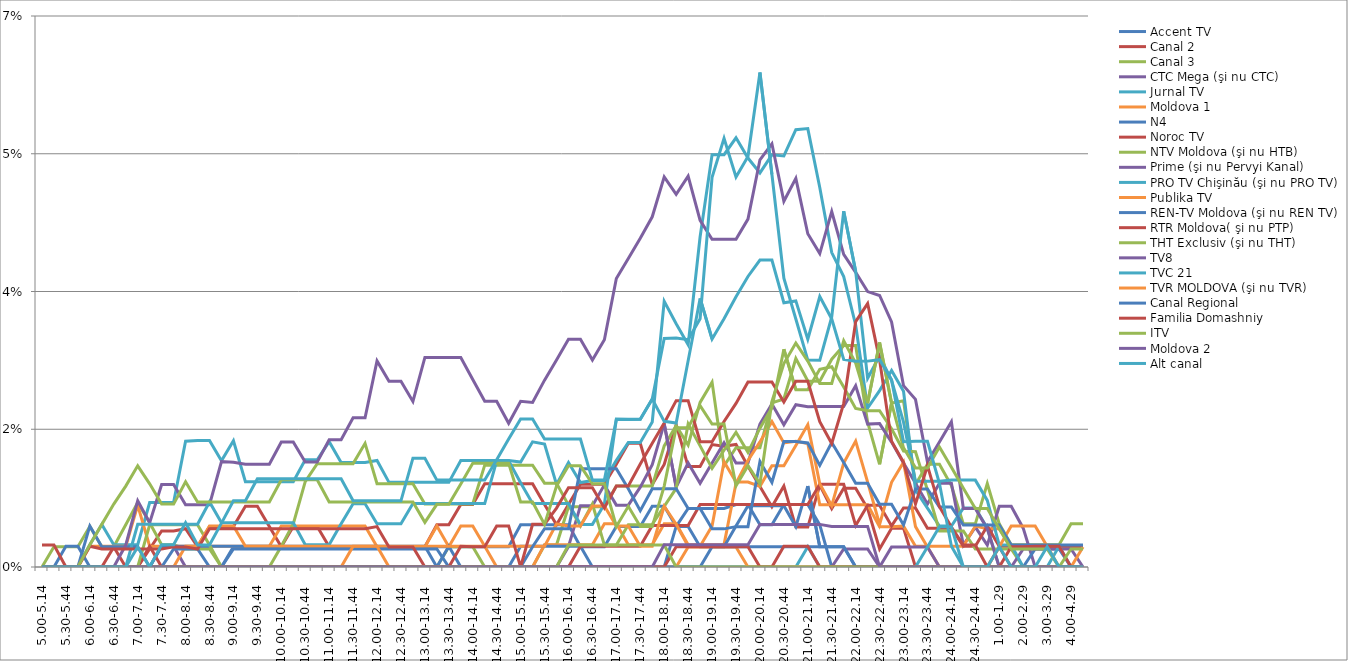
| Category | Accent TV | Canal 2 | Canal 3 | CTC Mega (şi nu CTC) | Jurnal TV | Moldova 1 | N4 | Noroc TV | NTV Moldova (şi nu HTB) | Prime (şi nu Pervyi Kanal) | PRO TV Chişinău (şi nu PRO TV) | Publika TV  | REN-TV Moldova (şi nu REN TV)  | RTR Moldova( şi nu PTP)  | THT Exclusiv (şi nu THT) | TV8 | TVC 21 | TVR MOLDOVA (şi nu TVR) | Canal Regional | Familia Domashniy | ITV | Moldova 2 | Alt canal |
|---|---|---|---|---|---|---|---|---|---|---|---|---|---|---|---|---|---|---|---|---|---|---|---|
| 5.00-5.14 | 0 | 0 | 0 | 0 | 0 | 0 | 0 | 0 | 0 | 0 | 0 | 0 | 0 | 0.003 | 0 | 0 | 0 | 0 | 0 | 0 | 0 | 0 | 0 |
| 5.15-5.29 | 0 | 0 | 0.003 | 0 | 0 | 0 | 0 | 0 | 0 | 0 | 0 | 0 | 0 | 0.003 | 0 | 0 | 0 | 0 | 0 | 0 | 0 | 0 | 0 |
| 5.30-5.44 | 0 | 0 | 0.003 | 0 | 0 | 0 | 0 | 0 | 0 | 0 | 0 | 0 | 0.003 | 0 | 0 | 0 | 0 | 0 | 0 | 0 | 0 | 0 | 0 |
| 5.45-5.59 | 0 | 0 | 0.003 | 0 | 0 | 0 | 0 | 0 | 0 | 0 | 0 | 0 | 0.003 | 0 | 0 | 0 | 0 | 0 | 0 | 0 | 0 | 0 | 0 |
| 6.00-6.14 | 0 | 0 | 0.005 | 0 | 0.003 | 0.003 | 0.005 | 0 | 0 | 0 | 0 | 0 | 0 | 0.003 | 0.003 | 0 | 0 | 0 | 0 | 0 | 0 | 0 | 0 |
| 6.15-6.29 | 0 | 0 | 0.003 | 0 | 0.005 | 0.003 | 0.003 | 0 | 0 | 0 | 0 | 0 | 0 | 0.002 | 0.005 | 0 | 0 | 0 | 0 | 0 | 0 | 0 | 0 |
| 6.30-6.44 | 0 | 0.003 | 0.003 | 0 | 0.003 | 0.003 | 0.003 | 0 | 0 | 0 | 0 | 0 | 0 | 0.002 | 0.008 | 0 | 0 | 0 | 0 | 0 | 0 | 0 | 0 |
| 6.45-6.59 | 0 | 0 | 0.005 | 0 | 0.003 | 0.003 | 0.003 | 0 | 0 | 0.003 | 0 | 0 | 0 | 0.002 | 0.01 | 0 | 0 | 0 | 0 | 0 | 0 | 0 | 0 |
| 7.00-7.14 | 0 | 0 | 0.008 | 0 | 0.003 | 0.008 | 0.003 | 0 | 0 | 0.008 | 0.005 | 0 | 0 | 0.002 | 0.013 | 0 | 0 | 0 | 0 | 0 | 0 | 0 | 0.003 |
| 7.15-7.29 | 0 | 0.002 | 0.006 | 0 | 0.008 | 0.003 | 0 | 0.003 | 0.005 | 0.006 | 0.005 | 0 | 0 | 0.002 | 0.011 | 0 | 0 | 0 | 0 | 0 | 0 | 0 | 0 |
| 7.30-7.44 | 0 | 0.005 | 0.003 | 0.003 | 0.008 | 0.003 | 0.003 | 0 | 0.005 | 0.01 | 0.005 | 0 | 0 | 0.002 | 0.008 | 0 | 0 | 0 | 0 | 0 | 0 | 0 | 0.003 |
| 7.45-7.59 | 0 | 0.005 | 0.003 | 0.003 | 0.008 | 0.003 | 0.003 | 0 | 0.005 | 0.01 | 0.005 | 0 | 0.002 | 0.003 | 0.008 | 0 | 0 | 0 | 0 | 0 | 0 | 0 | 0.003 |
| 8.00-8.14 | 0 | 0.005 | 0.002 | 0 | 0.016 | 0.003 | 0.003 | 0 | 0.005 | 0.008 | 0.005 | 0.003 | 0.002 | 0.003 | 0.011 | 0 | 0 | 0 | 0 | 0 | 0 | 0 | 0.006 |
| 8.15-8.29 | 0 | 0.003 | 0.002 | 0 | 0.016 | 0.003 | 0.003 | 0 | 0.005 | 0.008 | 0.005 | 0.003 | 0.002 | 0.002 | 0.008 | 0 | 0 | 0 | 0 | 0 | 0 | 0 | 0.003 |
| 8.30-8.44 | 0 | 0.005 | 0.002 | 0 | 0.016 | 0.003 | 0.003 | 0 | 0.003 | 0.008 | 0.008 | 0.005 | 0 | 0.005 | 0.008 | 0 | 0 | 0 | 0 | 0 | 0 | 0 | 0.003 |
| 8.45-8.59 | 0 | 0.005 | 0 | 0 | 0.013 | 0.003 | 0.003 | 0 | 0 | 0.013 | 0.006 | 0.005 | 0 | 0.005 | 0.008 | 0 | 0 | 0 | 0 | 0 | 0 | 0 | 0.006 |
| 9.00-9.14 | 0.003 | 0.005 | 0 | 0 | 0.016 | 0.003 | 0.003 | 0 | 0 | 0.013 | 0.006 | 0.005 | 0.002 | 0.005 | 0.008 | 0 | 0 | 0 | 0 | 0 | 0 | 0 | 0.008 |
| 9.15-9.29 | 0.003 | 0.008 | 0 | 0 | 0.011 | 0.003 | 0.003 | 0 | 0 | 0.013 | 0.006 | 0.003 | 0.002 | 0.005 | 0.008 | 0 | 0 | 0 | 0 | 0 | 0 | 0 | 0.008 |
| 9.30-9.44 | 0.003 | 0.008 | 0 | 0 | 0.011 | 0.003 | 0.003 | 0 | 0 | 0.013 | 0.006 | 0.003 | 0.002 | 0.005 | 0.008 | 0 | 0 | 0 | 0 | 0 | 0 | 0 | 0.011 |
| 9.45-9.59 | 0.003 | 0.005 | 0 | 0 | 0.011 | 0.003 | 0.003 | 0 | 0 | 0.013 | 0.006 | 0.003 | 0.002 | 0.005 | 0.008 | 0 | 0 | 0 | 0 | 0 | 0 | 0 | 0.011 |
| 10.00-10.14 | 0.003 | 0.003 | 0 | 0 | 0.011 | 0.005 | 0.003 | 0 | 0.003 | 0.016 | 0.006 | 0.003 | 0.002 | 0.005 | 0.011 | 0 | 0 | 0 | 0 | 0 | 0 | 0 | 0.011 |
| 10.15-10.29 | 0.003 | 0.005 | 0 | 0 | 0.011 | 0.005 | 0.003 | 0 | 0.005 | 0.016 | 0.006 | 0.003 | 0.002 | 0.005 | 0.011 | 0 | 0 | 0 | 0 | 0 | 0 | 0 | 0.011 |
| 10.30-10.44 | 0.003 | 0.005 | 0 | 0 | 0.014 | 0.005 | 0.003 | 0 | 0.011 | 0.013 | 0.003 | 0.003 | 0.002 | 0.005 | 0.011 | 0 | 0 | 0 | 0 | 0 | 0 | 0 | 0.011 |
| 10.45-10.59 | 0.003 | 0.005 | 0 | 0 | 0.014 | 0.005 | 0.003 | 0 | 0.013 | 0.013 | 0.003 | 0.003 | 0.002 | 0.005 | 0.011 | 0 | 0 | 0 | 0 | 0 | 0 | 0 | 0.011 |
| 11.00-11.14 | 0.003 | 0.003 | 0 | 0 | 0.016 | 0.005 | 0.003 | 0 | 0.013 | 0.016 | 0.003 | 0.003 | 0.002 | 0.005 | 0.008 | 0 | 0 | 0 | 0 | 0 | 0 | 0 | 0.011 |
| 11.15-11.29 | 0.003 | 0.003 | 0 | 0 | 0.013 | 0.005 | 0.003 | 0 | 0.013 | 0.016 | 0.005 | 0.003 | 0.002 | 0.005 | 0.008 | 0 | 0 | 0 | 0 | 0 | 0 | 0 | 0.011 |
| 11.30-11.44 | 0.003 | 0.003 | 0 | 0 | 0.013 | 0.005 | 0.003 | 0 | 0.013 | 0.019 | 0.008 | 0.003 | 0.002 | 0.005 | 0.008 | 0 | 0 | 0.003 | 0 | 0 | 0 | 0 | 0.008 |
| 11.45-11.59 | 0.003 | 0.003 | 0 | 0 | 0.013 | 0.005 | 0.003 | 0 | 0.016 | 0.019 | 0.008 | 0.003 | 0.002 | 0.005 | 0.008 | 0 | 0 | 0.003 | 0 | 0 | 0 | 0 | 0.008 |
| 12.00-12.14 | 0.003 | 0.003 | 0 | 0 | 0.014 | 0.003 | 0.003 | 0 | 0.011 | 0.026 | 0.005 | 0.003 | 0.002 | 0.005 | 0.008 | 0 | 0 | 0.003 | 0 | 0 | 0 | 0 | 0.008 |
| 12.15-12.29 | 0.003 | 0.003 | 0 | 0 | 0.011 | 0.003 | 0.003 | 0 | 0.011 | 0.024 | 0.005 | 0.003 | 0.002 | 0.003 | 0.008 | 0 | 0 | 0 | 0 | 0 | 0 | 0 | 0.008 |
| 12.30-12.44 | 0.003 | 0.003 | 0 | 0 | 0.011 | 0.003 | 0.003 | 0 | 0.011 | 0.024 | 0.005 | 0.003 | 0.002 | 0.003 | 0.008 | 0 | 0 | 0 | 0 | 0 | 0 | 0 | 0.008 |
| 12.45-12.59 | 0.003 | 0.003 | 0 | 0 | 0.011 | 0.003 | 0.003 | 0 | 0.011 | 0.021 | 0.008 | 0.003 | 0.002 | 0.003 | 0.008 | 0 | 0 | 0 | 0 | 0 | 0 | 0 | 0.014 |
| 13.00-13.14 | 0.003 | 0.003 | 0 | 0 | 0.011 | 0.003 | 0.003 | 0 | 0.008 | 0.027 | 0.008 | 0.003 | 0.002 | 0 | 0.006 | 0 | 0 | 0 | 0 | 0 | 0 | 0 | 0.014 |
| 13.15-13.29 | 0.003 | 0.005 | 0 | 0 | 0.011 | 0.005 | 0 | 0 | 0.008 | 0.027 | 0.008 | 0.003 | 0.002 | 0 | 0.008 | 0 | 0 | 0 | 0 | 0 | 0 | 0 | 0.011 |
| 13.30-13.44 | 0.003 | 0.005 | 0.003 | 0 | 0.011 | 0.003 | 0.003 | 0 | 0.008 | 0.027 | 0.008 | 0.003 | 0 | 0 | 0.008 | 0 | 0 | 0 | 0 | 0 | 0 | 0 | 0.011 |
| 13.45-13.59 | 0.003 | 0.008 | 0.003 | 0 | 0.014 | 0.005 | 0 | 0 | 0.008 | 0.027 | 0.008 | 0.003 | 0 | 0.003 | 0.011 | 0 | 0 | 0 | 0 | 0 | 0 | 0 | 0.011 |
| 14.00-14.14 | 0.003 | 0.008 | 0.003 | 0 | 0.014 | 0.005 | 0 | 0 | 0.008 | 0.024 | 0.008 | 0.003 | 0 | 0.003 | 0.013 | 0 | 0 | 0 | 0 | 0 | 0 | 0 | 0.011 |
| 14.15-14.29 | 0.003 | 0.011 | 0 | 0 | 0.014 | 0.003 | 0 | 0 | 0.013 | 0.021 | 0.008 | 0.003 | 0 | 0.003 | 0.013 | 0 | 0 | 0 | 0 | 0 | 0 | 0 | 0.011 |
| 14.30-14.44 | 0.003 | 0.011 | 0 | 0 | 0.014 | 0 | 0 | 0 | 0.013 | 0.021 | 0.013 | 0.003 | 0 | 0.005 | 0.013 | 0 | 0 | 0 | 0 | 0 | 0 | 0 | 0.014 |
| 14.45-14.59 | 0.003 | 0.011 | 0 | 0 | 0.014 | 0 | 0 | 0 | 0.013 | 0.018 | 0.013 | 0.003 | 0 | 0.005 | 0.013 | 0 | 0 | 0 | 0 | 0 | 0 | 0 | 0.016 |
| 15.00-15.14 | 0.005 | 0.011 | 0 | 0 | 0.013 | 0 | 0.003 | 0 | 0.013 | 0.021 | 0.011 | 0.003 | 0 | 0 | 0.008 | 0 | 0 | 0 | 0 | 0 | 0 | 0 | 0.019 |
| 15.15-15.29 | 0.005 | 0.011 | 0 | 0 | 0.016 | 0 | 0.003 | 0 | 0.013 | 0.021 | 0.008 | 0.003 | 0.003 | 0.005 | 0.008 | 0 | 0 | 0 | 0 | 0 | 0 | 0 | 0.019 |
| 15.30-15.44 | 0.005 | 0.008 | 0.003 | 0 | 0.016 | 0.003 | 0.003 | 0 | 0.011 | 0.024 | 0.008 | 0.003 | 0.005 | 0.005 | 0.005 | 0 | 0 | 0 | 0 | 0 | 0 | 0 | 0.016 |
| 15.45-15.59 | 0.005 | 0.005 | 0.003 | 0 | 0.01 | 0.003 | 0.003 | 0 | 0.011 | 0.026 | 0.008 | 0.005 | 0.005 | 0.007 | 0.01 | 0 | 0 | 0 | 0 | 0 | 0 | 0 | 0.016 |
| 16.00-16.14 | 0.005 | 0.008 | 0.008 | 0.003 | 0.013 | 0.003 | 0.003 | 0 | 0.008 | 0.029 | 0.008 | 0.005 | 0.005 | 0.01 | 0.013 | 0 | 0 | 0 | 0 | 0 | 0.003 | 0 | 0.016 |
| 16.15-16.29 | 0.003 | 0.011 | 0.008 | 0.008 | 0.011 | 0.003 | 0.003 | 0.003 | 0.005 | 0.029 | 0.005 | 0.005 | 0.012 | 0.01 | 0.013 | 0 | 0 | 0 | 0 | 0 | 0.003 | 0 | 0.016 |
| 16.30-16.44 | 0.003 | 0.011 | 0.008 | 0.008 | 0.011 | 0.003 | 0 | 0.003 | 0.008 | 0.026 | 0.005 | 0.008 | 0.012 | 0.01 | 0.011 | 0 | 0 | 0 | 0 | 0 | 0.003 | 0 | 0.011 |
| 16.45-16.59 | 0.003 | 0.011 | 0.008 | 0.01 | 0.011 | 0.005 | 0 | 0.003 | 0.003 | 0.029 | 0.008 | 0.008 | 0.012 | 0.008 | 0.011 | 0 | 0 | 0 | 0 | 0 | 0.003 | 0 | 0.011 |
| 17.00-17.14 | 0.005 | 0.013 | 0.01 | 0.008 | 0.014 | 0.005 | 0 | 0.003 | 0.003 | 0.037 | 0.019 | 0.005 | 0.012 | 0.01 | 0.005 | 0 | 0 | 0 | 0 | 0 | 0.003 | 0 | 0.019 |
| 17.15-17.29 | 0.005 | 0.016 | 0.01 | 0.008 | 0.016 | 0.003 | 0 | 0.003 | 0.005 | 0.039 | 0.019 | 0.005 | 0.01 | 0.01 | 0.008 | 0 | 0 | 0 | 0 | 0 | 0.003 | 0 | 0.019 |
| 17.30-17.44 | 0.005 | 0.016 | 0.01 | 0.01 | 0.016 | 0.003 | 0 | 0.003 | 0.005 | 0.042 | 0.019 | 0.003 | 0.007 | 0.013 | 0.005 | 0 | 0 | 0 | 0 | 0 | 0.003 | 0 | 0.019 |
| 17.45-17.59 | 0.008 | 0.01 | 0.01 | 0.013 | 0.018 | 0.003 | 0 | 0.005 | 0.005 | 0.044 | 0.021 | 0.003 | 0.01 | 0.016 | 0.005 | 0 | 0 | 0 | 0 | 0 | 0.003 | 0 | 0.021 |
| 18.00-18.14 | 0.008 | 0.013 | 0.015 | 0.018 | 0.034 | 0.005 | 0 | 0.005 | 0.008 | 0.05 | 0.029 | 0.008 | 0.01 | 0.018 | 0.01 | 0 | 0 | 0 | 0 | 0 | 0.003 | 0.003 | 0.019 |
| 18.15-18.29 | 0.005 | 0.018 | 0.018 | 0.01 | 0.031 | 0.005 | 0.005 | 0.005 | 0.01 | 0.047 | 0.029 | 0.005 | 0.01 | 0.021 | 0.018 | 0 | 0 | 0 | 0 | 0.003 | 0 | 0.003 | 0.018 |
| 18.30-18.44 | 0.007 | 0.013 | 0.015 | 0.013 | 0.028 | 0.003 | 0.005 | 0.005 | 0.018 | 0.05 | 0.029 | 0.003 | 0.007 | 0.021 | 0.018 | 0 | 0 | 0.003 | 0 | 0.003 | 0 | 0.003 | 0.026 |
| 18.45-18.59 | 0.007 | 0.013 | 0.021 | 0.011 | 0.042 | 0.003 | 0.003 | 0.008 | 0.015 | 0.044 | 0.032 | 0.003 | 0.007 | 0.016 | 0.021 | 0 | 0 | 0.003 | 0 | 0.003 | 0 | 0.003 | 0.034 |
| 19.00-19.14 | 0.007 | 0.016 | 0.023 | 0.013 | 0.052 | 0.003 | 0.003 | 0.008 | 0.013 | 0.042 | 0.05 | 0.005 | 0.005 | 0.016 | 0.018 | 0 | 0 | 0.003 | 0.003 | 0.003 | 0 | 0.003 | 0.029 |
| 19.15-19.29 | 0.007 | 0.015 | 0.013 | 0.016 | 0.052 | 0.003 | 0.003 | 0.008 | 0.015 | 0.042 | 0.054 | 0.013 | 0.005 | 0.018 | 0.018 | 0 | 0 | 0.003 | 0.003 | 0.003 | 0 | 0.003 | 0.032 |
| 19.30-19.44 | 0.008 | 0.016 | 0.015 | 0.013 | 0.055 | 0.011 | 0.005 | 0.008 | 0.017 | 0.042 | 0.05 | 0.011 | 0.005 | 0.021 | 0.01 | 0 | 0 | 0.003 | 0.003 | 0.003 | 0 | 0.003 | 0.034 |
| 19.45-19.59 | 0.008 | 0.013 | 0.015 | 0.013 | 0.052 | 0.014 | 0.008 | 0.008 | 0.015 | 0.044 | 0.052 | 0.011 | 0.005 | 0.024 | 0.013 | 0 | 0 | 0 | 0.003 | 0.003 | 0 | 0.003 | 0.037 |
| 20.00-20.14 | 0.005 | 0.01 | 0.015 | 0.018 | 0.05 | 0.016 | 0.008 | 0.008 | 0.018 | 0.052 | 0.063 | 0.01 | 0.013 | 0.024 | 0.011 | 0 | 0 | 0 | 0.003 | 0 | 0 | 0.005 | 0.039 |
| 20.15-20.29 | 0.005 | 0.008 | 0.021 | 0.021 | 0.052 | 0.018 | 0.008 | 0.008 | 0.02 | 0.054 | 0.05 | 0.013 | 0.011 | 0.024 | 0.021 | 0 | 0 | 0 | 0.003 | 0 | 0 | 0.005 | 0.039 |
| 20.30-20.44 | 0.008 | 0.01 | 0.021 | 0.018 | 0.052 | 0.016 | 0.008 | 0.008 | 0.028 | 0.046 | 0.037 | 0.013 | 0.016 | 0.021 | 0.026 | 0 | 0 | 0 | 0.003 | 0.003 | 0 | 0.005 | 0.034 |
| 20.45-20.59 | 0.008 | 0.005 | 0.026 | 0.021 | 0.056 | 0.016 | 0.005 | 0.008 | 0.023 | 0.049 | 0.032 | 0.015 | 0.016 | 0.024 | 0.028 | 0 | 0 | 0 | 0.003 | 0.003 | 0 | 0.005 | 0.034 |
| 21.00-21.14 | 0.008 | 0.005 | 0.024 | 0.02 | 0.056 | 0.016 | 0.01 | 0.008 | 0.023 | 0.042 | 0.026 | 0.018 | 0.016 | 0.024 | 0.026 | 0 | 0.003 | 0 | 0.003 | 0.003 | 0 | 0.005 | 0.029 |
| 21.15-21.29 | 0.005 | 0.01 | 0.024 | 0.02 | 0.048 | 0.008 | 0.003 | 0.011 | 0.025 | 0.04 | 0.026 | 0.011 | 0.013 | 0.018 | 0.023 | 0 | 0 | 0 | 0.003 | 0 | 0 | 0.005 | 0.034 |
| 21.30-21.44 | 0 | 0.007 | 0.026 | 0.02 | 0.04 | 0.008 | 0.003 | 0.011 | 0.025 | 0.045 | 0.032 | 0.008 | 0.016 | 0.016 | 0.023 | 0 | 0 | 0 | 0.003 | 0 | 0 | 0.005 | 0.032 |
| 21.45-21.59 | 0 | 0.01 | 0.028 | 0.02 | 0.037 | 0.008 | 0.003 | 0.011 | 0.023 | 0.04 | 0.045 | 0.013 | 0.013 | 0.021 | 0.029 | 0.002 | 0 | 0 | 0.003 | 0 | 0 | 0.005 | 0.026 |
| 22.00-22.14 | 0 | 0.01 | 0.028 | 0.023 | 0.031 | 0.008 | 0 | 0.005 | 0.02 | 0.037 | 0.038 | 0.016 | 0.011 | 0.031 | 0.026 | 0.002 | 0 | 0 | 0 | 0 | 0 | 0.005 | 0.026 |
| 22.15-22.29 | 0 | 0.007 | 0.018 | 0.018 | 0.02 | 0.008 | 0 | 0.008 | 0.02 | 0.035 | 0.024 | 0.011 | 0.011 | 0.033 | 0.021 | 0.002 | 0 | 0 | 0 | 0 | 0 | 0.005 | 0.026 |
| 22.30-22.44 | 0 | 0.002 | 0.013 | 0.018 | 0.022 | 0.005 | 0 | 0.008 | 0.02 | 0.034 | 0.027 | 0.005 | 0.008 | 0.026 | 0.029 | 0 | 0 | 0 | 0 | 0 | 0 | 0 | 0.026 |
| 22.45-22.59 | 0 | 0.005 | 0.021 | 0.016 | 0.025 | 0.005 | 0 | 0.005 | 0.018 | 0.031 | 0.024 | 0.011 | 0.008 | 0.016 | 0.021 | 0.003 | 0 | 0 | 0 | 0 | 0 | 0 | 0.024 |
| 23.00-23.14 | 0 | 0.005 | 0.021 | 0.013 | 0.022 | 0.005 | 0 | 0.008 | 0.015 | 0.023 | 0.018 | 0.013 | 0.005 | 0.013 | 0.015 | 0.003 | 0 | 0 | 0 | 0 | 0 | 0 | 0.016 |
| 23.15-23.29 | 0 | 0 | 0.01 | 0.011 | 0.01 | 0.003 | 0 | 0.008 | 0.015 | 0.021 | 0.011 | 0.005 | 0.01 | 0.008 | 0.013 | 0.003 | 0 | 0 | 0 | 0 | 0 | 0 | 0.016 |
| 23.30-23.44 | 0 | 0 | 0.013 | 0.008 | 0.007 | 0.003 | 0 | 0.005 | 0.01 | 0.013 | 0.011 | 0.003 | 0.01 | 0.013 | 0.013 | 0.003 | 0.003 | 0 | 0 | 0 | 0 | 0 | 0.016 |
| 23.45-23.59 | 0 | 0 | 0.013 | 0.011 | 0.005 | 0.003 | 0 | 0.005 | 0.005 | 0.016 | 0.011 | 0 | 0.008 | 0.008 | 0.015 | 0 | 0.005 | 0 | 0 | 0 | 0 | 0 | 0.011 |
| 24.00-24.14 | 0 | 0 | 0.01 | 0.011 | 0.005 | 0.003 | 0 | 0.005 | 0.005 | 0.018 | 0.011 | 0 | 0.008 | 0.005 | 0.013 | 0 | 0.005 | 0 | 0 | 0 | 0 | 0 | 0.003 |
| 24.15-24.29 | 0 | 0 | 0.005 | 0.003 | 0.007 | 0.003 | 0 | 0.003 | 0.005 | 0.007 | 0.011 | 0 | 0.005 | 0.003 | 0.01 | 0 | 0 | 0 | 0 | 0 | 0 | 0 | 0 |
| 24.30-24.44 | 0 | 0 | 0.005 | 0.005 | 0.007 | 0.005 | 0 | 0.003 | 0.002 | 0.007 | 0.011 | 0 | 0.005 | 0.003 | 0.007 | 0 | 0 | 0 | 0 | 0 | 0 | 0 | 0 |
| 24.45-24.59 | 0 | 0 | 0.011 | 0.003 | 0.005 | 0.005 | 0 | 0.005 | 0.002 | 0.005 | 0.008 | 0 | 0.005 | 0 | 0.007 | 0 | 0 | 0 | 0 | 0 | 0 | 0 | 0 |
| 1.00-1.29 | 0 | 0.003 | 0.005 | 0.008 | 0 | 0.005 | 0 | 0.003 | 0.002 | 0 | 0.003 | 0.003 | 0.005 | 0 | 0.005 | 0 | 0 | 0 | 0 | 0 | 0 | 0 | 0.003 |
| 1.30-1. 59 | 0 | 0 | 0.003 | 0.008 | 0 | 0.003 | 0 | 0.003 | 0.002 | 0 | 0.003 | 0.005 | 0.003 | 0.003 | 0.002 | 0 | 0 | 0 | 0 | 0 | 0 | 0 | 0 |
| 2.00-2.29 | 0 | 0 | 0.003 | 0.005 | 0 | 0.003 | 0 | 0.003 | 0 | 0.002 | 0 | 0.005 | 0.003 | 0.003 | 0.002 | 0 | 0 | 0 | 0 | 0 | 0 | 0 | 0 |
| 2.30-2.59 | 0 | 0 | 0.003 | 0 | 0 | 0.003 | 0.002 | 0.003 | 0 | 0.002 | 0 | 0.005 | 0.003 | 0.003 | 0.002 | 0 | 0 | 0 | 0 | 0 | 0 | 0 | 0 |
| 3.00-3.29 | 0 | 0 | 0.003 | 0 | 0 | 0.003 | 0.002 | 0.003 | 0 | 0.002 | 0 | 0.003 | 0.003 | 0.003 | 0.002 | 0 | 0 | 0 | 0 | 0 | 0 | 0 | 0.003 |
| 3.30-3.59 | 0 | 0 | 0.003 | 0 | 0 | 0.003 | 0.002 | 0.003 | 0 | 0.002 | 0.003 | 0 | 0.003 | 0.003 | 0 | 0 | 0 | 0 | 0 | 0 | 0 | 0 | 0 |
| 4.00-4.29 | 0 | 0 | 0.005 | 0 | 0 | 0.003 | 0 | 0.003 | 0 | 0.002 | 0 | 0 | 0.003 | 0 | 0.002 | 0 | 0 | 0 | 0 | 0 | 0 | 0 | 0 |
| 4.30-4.59 | 0 | 0 | 0.005 | 0 | 0 | 0.003 | 0 | 0.003 | 0 | 0 | 0 | 0.003 | 0.003 | 0 | 0.002 | 0 | 0 | 0 | 0 | 0 | 0 | 0 | 0 |